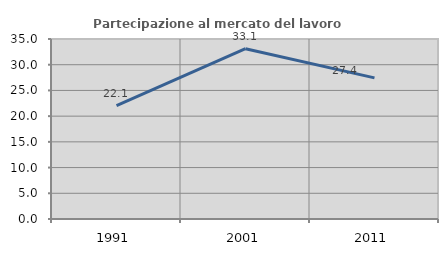
| Category | Partecipazione al mercato del lavoro  femminile |
|---|---|
| 1991.0 | 22.065 |
| 2001.0 | 33.118 |
| 2011.0 | 27.44 |